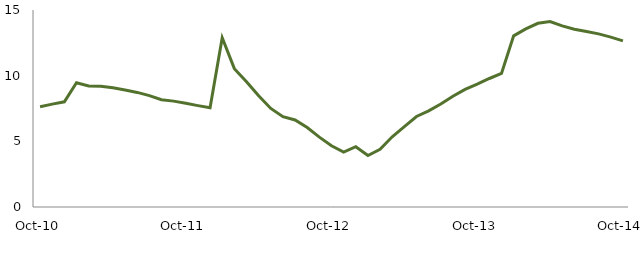
| Category | Series 0 |
|---|---|
| Oct-10 | 7.635 |
|  | 7.833 |
|  | 8.011 |
|  | 9.465 |
|  | 9.221 |
|  | 9.199 |
|  | 9.073 |
|  | 8.902 |
|  | 8.725 |
|  | 8.478 |
|  | 8.171 |
|  | 8.061 |
| Oct-11 | 7.897 |
|  | 7.718 |
|  | 7.555 |
|  | 12.888 |
|  | 10.533 |
|  | 9.535 |
|  | 8.464 |
|  | 7.503 |
|  | 6.876 |
|  | 6.627 |
|  | 6.048 |
|  | 5.317 |
| Oct-12 | 4.667 |
|  | 4.185 |
|  | 4.593 |
|  | 3.923 |
|  | 4.399 |
|  | 5.348 |
|  | 6.118 |
|  | 6.892 |
|  | 7.316 |
|  | 7.838 |
|  | 8.434 |
|  | 8.951 |
| Oct-13 | 9.352 |
|  | 9.785 |
|  | 10.174 |
|  | 13.032 |
|  | 13.557 |
|  | 13.989 |
|  | 14.123 |
|  | 13.79 |
|  | 13.541 |
|  | 13.364 |
|  | 13.18 |
|  | 12.932 |
| Oct-14 | 12.647 |